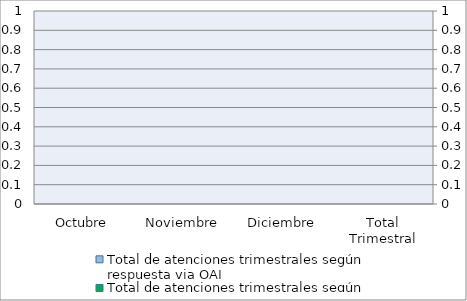
| Category | Total de atenciones trimestrales según respuesta via OAI | Series 2 | Series 4 |
|---|---|---|---|
| Octubre | 0 |  |  |
| Noviembre | 0 |  |  |
| Diciembre | 0 |  |  |
| Total Trimestral | 0 |  |  |